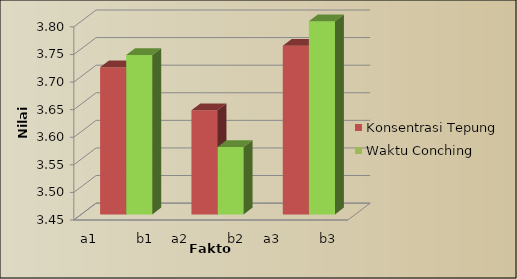
| Category | Konsentrasi Tepung | Waktu Conching |
|---|---|---|
| a1          b1 | 3.717 | 3.739 |
| a2          b2 | 3.639 | 3.572 |
| a3          b3 | 3.756 | 3.8 |